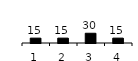
| Category | Series 0 |
|---|---|
| 1.0 | 15 |
| 2.0 | 15 |
| 3.0 | 30 |
| 4.0 | 15 |